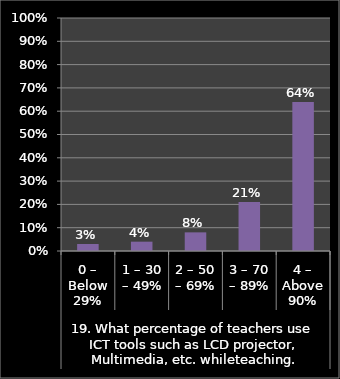
| Category | Series 0 |
|---|---|
| 0 | 0.03 |
| 1 | 0.04 |
| 2 | 0.08 |
| 3 | 0.21 |
| 4 | 0.64 |